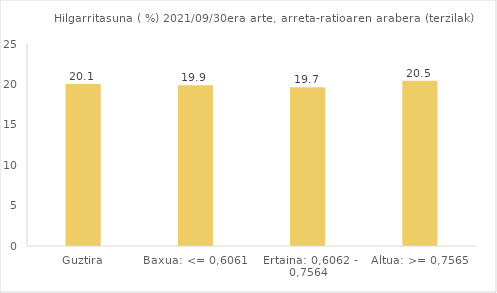
| Category | Series 0 |
|---|---|
| Guztira | 20.055 |
| Baxua: <= 0,6061 | 19.892 |
| Ertaina: 0,6062 - 0,7564 | 19.651 |
| Altua: >= 0,7565 | 20.464 |